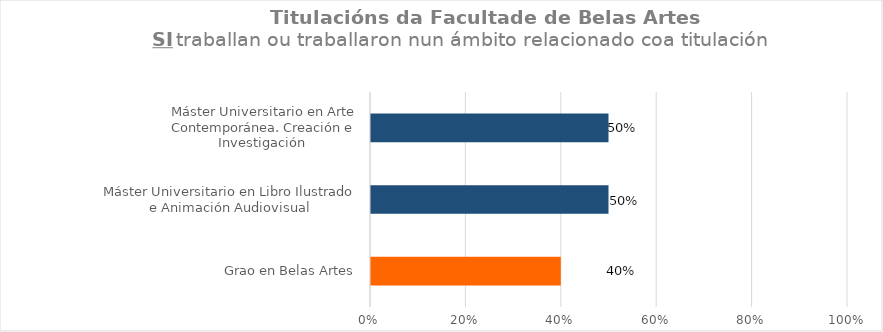
| Category | Series 1 |
|---|---|
| Grao en Belas Artes | 0.4 |
| Máster Universitario en Libro Ilustrado e Animación Audiovisual | 0.5 |
| Máster Universitario en Arte Contemporánea. Creación e Investigación  | 0.5 |